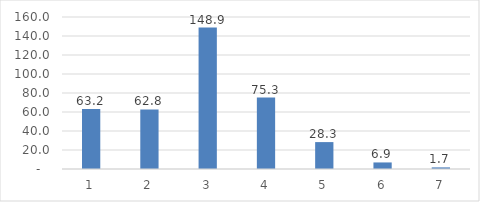
| Category | Frw Billion |
|---|---|
| 0 | 63.206 |
| 1 | 62.757 |
| 2 | 148.916 |
| 3 | 75.262 |
| 4 | 28.321 |
| 5 | 6.902 |
| 6 | 1.701 |